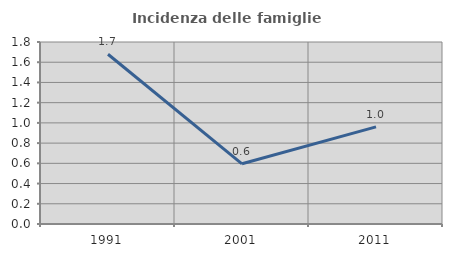
| Category | Incidenza delle famiglie numerose |
|---|---|
| 1991.0 | 1.679 |
| 2001.0 | 0.595 |
| 2011.0 | 0.961 |